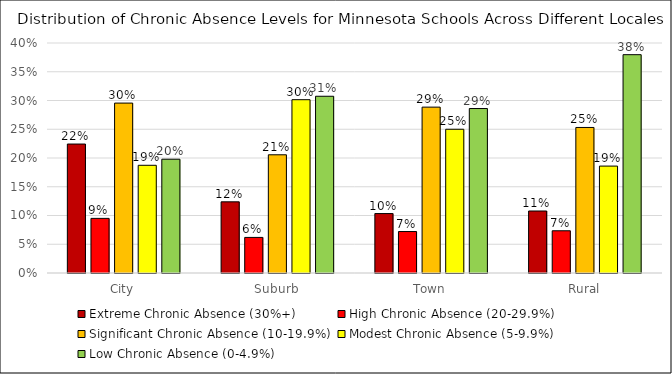
| Category | Extreme Chronic Absence (30%+) | High Chronic Absence (20-29.9%) | Significant Chronic Absence (10-19.9%) | Modest Chronic Absence (5-9.9%) | Low Chronic Absence (0-4.9%) |
|---|---|---|---|---|---|
| City | 0.224 | 0.095 | 0.296 | 0.187 | 0.198 |
| Suburb | 0.124 | 0.062 | 0.206 | 0.301 | 0.307 |
| Town | 0.103 | 0.072 | 0.288 | 0.25 | 0.286 |
| Rural | 0.108 | 0.073 | 0.253 | 0.186 | 0.38 |